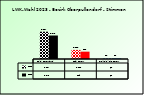
| Category | 2018 | 2023 |
|---|---|---|
| Bgld. Bauernbund | 3307 | 2848 |
| SPÖ Bauern | 1102 | 889 |
| Freiheitliche Bauern | 61 | 63 |